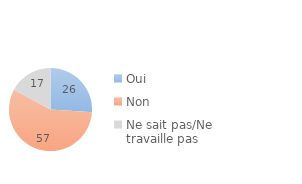
| Category | Series 0 |
|---|---|
| Oui | 26.018 |
| Non | 56.776 |
| Ne sait pas/Ne travaille pas | 17.147 |